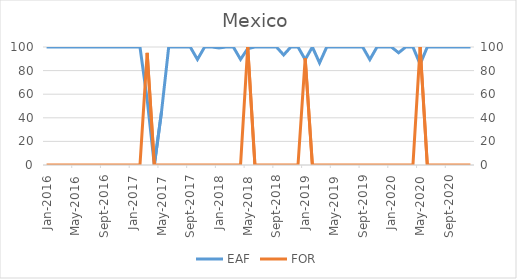
| Category | EAF |
|---|---|
| 2016-01-01 | 100 |
| 2016-02-01 | 100 |
| 2016-03-01 | 100 |
| 2016-04-01 | 100 |
| 2016-05-01 | 100 |
| 2016-06-01 | 100 |
| 2016-07-01 | 100 |
| 2016-08-01 | 100 |
| 2016-09-01 | 100 |
| 2016-10-01 | 100 |
| 2016-11-01 | 100 |
| 2016-12-01 | 100 |
| 2017-01-01 | 100 |
| 2017-02-01 | 100 |
| 2017-03-01 | 55.6 |
| 2017-04-01 | 0 |
| 2017-05-01 | 45.16 |
| 2017-06-01 | 100 |
| 2017-07-01 | 100 |
| 2017-08-01 | 100 |
| 2017-09-01 | 100 |
| 2017-10-01 | 89.45 |
| 2017-11-01 | 100 |
| 2017-12-01 | 100 |
| 2018-01-01 | 99.2 |
| 2018-02-01 | 100 |
| 2018-03-01 | 100 |
| 2018-04-01 | 89.51 |
| 2018-05-01 | 98.61 |
| 2018-06-01 | 100 |
| 2018-07-01 | 100 |
| 2018-08-01 | 100 |
| 2018-09-01 | 100 |
| 2018-10-01 | 93.27 |
| 2018-11-01 | 100 |
| 2018-12-01 | 100 |
| 2019-01-01 | 89.35 |
| 2019-02-01 | 100 |
| 2019-03-01 | 86.5 |
| 2019-04-01 | 100 |
| 2019-05-01 | 100 |
| 2019-06-01 | 100 |
| 2019-07-01 | 100 |
| 2019-08-01 | 100 |
| 2019-09-01 | 100 |
| 2019-10-01 | 89.35 |
| 2019-11-01 | 100 |
| 2019-12-01 | 100 |
| 2020-01-01 | 100 |
| 2020-02-01 | 95.12 |
| 2020-03-01 | 100 |
| 2020-04-01 | 100 |
| 2020-05-01 | 85.43 |
| 2020-06-01 | 100 |
| 2020-07-01 | 100 |
| 2020-08-01 | 100 |
| 2020-09-01 | 100 |
| 2020-10-01 | 100 |
| 2020-11-01 | 100 |
| 2020-12-01 | 100 |